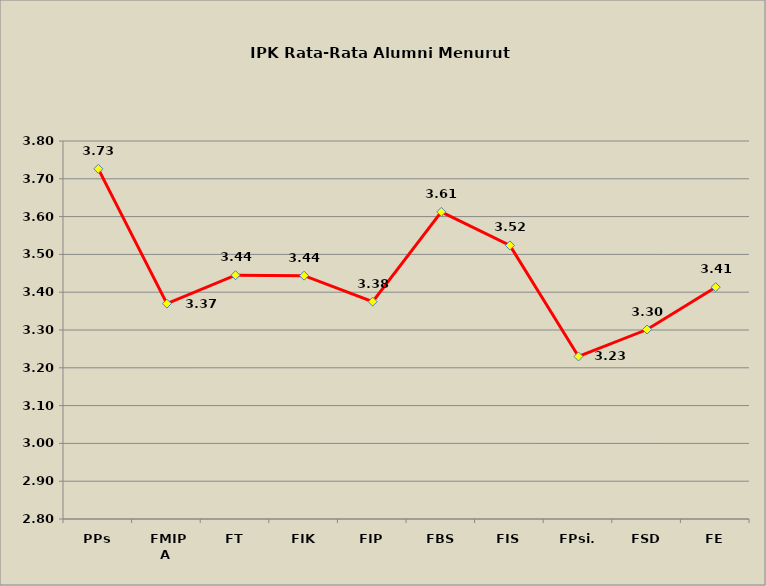
| Category | Series 0 |
|---|---|
|  PPs | 3.726 |
|  FMIPA | 3.37 |
|  FT | 3.445 |
|  FIK | 3.444 |
|  FIP | 3.375 |
|  FBS | 3.612 |
|  FIS | 3.524 |
|  FPsi. | 3.23 |
|  FSD | 3.301 |
|  FE | 3.413 |